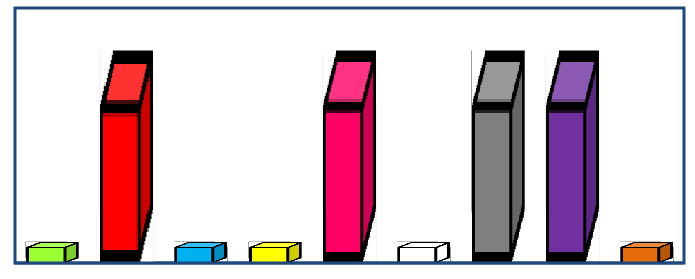
| Category | Series 0 |
|---|---|
| 0 | 1 |
| 1 | 10 |
| 2 | 1 |
| 3 | 1 |
| 4 | 10 |
| 5 | 1 |
| 6 | 10 |
| 7 | 10 |
| 8 | 1 |